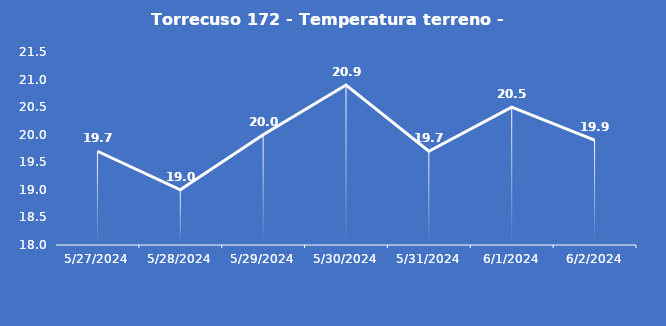
| Category | Torrecuso 172 - Temperatura terreno - Grezzo (°C) |
|---|---|
| 5/27/24 | 19.7 |
| 5/28/24 | 19 |
| 5/29/24 | 20 |
| 5/30/24 | 20.9 |
| 5/31/24 | 19.7 |
| 6/1/24 | 20.5 |
| 6/2/24 | 19.9 |